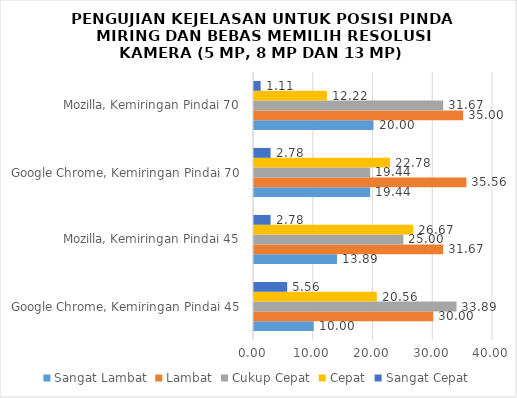
| Category | Sangat Lambat | Lambat | Cukup Cepat | Cepat | Sangat Cepat |
|---|---|---|---|---|---|
| Google Chrome, Kemiringan Pindai 45 | 10 | 30 | 33.889 | 20.556 | 5.556 |
| Mozilla, Kemiringan Pindai 45 | 13.889 | 31.667 | 25 | 26.667 | 2.778 |
| Google Chrome, Kemiringan Pindai 70 | 19.444 | 35.556 | 19.444 | 22.778 | 2.778 |
| Mozilla, Kemiringan Pindai 70 | 20 | 35 | 31.667 | 12.222 | 1.111 |